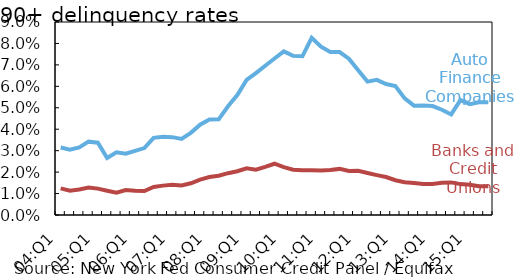
| Category | Auto Finance Companies | Banks and Credit Unions |
|---|---|---|
| 04:Q1 | 0.032 | 0.012 |
| 04:Q2 | 0.03 | 0.011 |
| 04:Q3 | 0.032 | 0.012 |
| 04:Q4 | 0.034 | 0.013 |
| 05:Q1 | 0.034 | 0.012 |
| 05:Q2 | 0.027 | 0.011 |
| 05:Q3 | 0.029 | 0.01 |
| 05:Q4 | 0.029 | 0.012 |
| 06:Q1 | 0.03 | 0.011 |
| 06:Q2 | 0.031 | 0.011 |
| 06:Q3 | 0.036 | 0.013 |
| 06:Q4 | 0.036 | 0.014 |
| 07:Q1 | 0.036 | 0.014 |
| 07:Q2 | 0.036 | 0.014 |
| 07:Q3 | 0.038 | 0.015 |
| 07:Q4 | 0.042 | 0.016 |
| 08:Q1 | 0.044 | 0.018 |
| 08:Q2 | 0.045 | 0.018 |
| 08:Q3 | 0.051 | 0.02 |
| 08:Q4 | 0.056 | 0.02 |
| 09:Q1 | 0.063 | 0.022 |
| 09:Q2 | 0.066 | 0.021 |
| 09:Q3 | 0.07 | 0.022 |
| 09:Q4 | 0.073 | 0.024 |
| 10:Q1 | 0.076 | 0.022 |
| 10:Q2 | 0.074 | 0.021 |
| 10:Q3 | 0.074 | 0.021 |
| 10:Q4 | 0.083 | 0.021 |
| 11:Q1 | 0.078 | 0.021 |
| 11:Q2 | 0.076 | 0.021 |
| 11:Q3 | 0.076 | 0.022 |
| 11:Q4 | 0.073 | 0.02 |
| 12:Q1 | 0.068 | 0.021 |
| 12:Q2 | 0.062 | 0.02 |
| 12:Q3 | 0.063 | 0.019 |
| 12:Q4 | 0.061 | 0.018 |
| 13:Q1 | 0.06 | 0.016 |
| 13:Q2 | 0.054 | 0.015 |
| 13:Q3 | 0.051 | 0.015 |
| 13:Q4 | 0.051 | 0.014 |
| 14:Q1 | 0.051 | 0.014 |
| 14:Q2 | 0.049 | 0.015 |
| 14:Q3 | 0.047 | 0.015 |
| 14:Q4 | 0.054 | 0.014 |
| 15:Q1 | 0.052 | 0.014 |
| 15:Q2 | 0.053 | 0.013 |
| 15:Q3 | 0.053 | 0.013 |